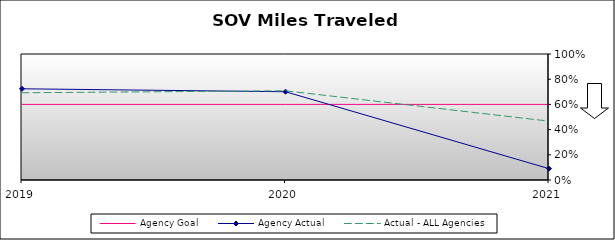
| Category | Agency Goal | Agency Actual | Actual - ALL Agencies |
|---|---|---|---|
| 2019.0 | 0.6 | 0.724 | 0.692 |
| 2020.0 | 0.6 | 0.7 | 0.708 |
| 2021.0 | 0.6 | 0.09 | 0.467 |